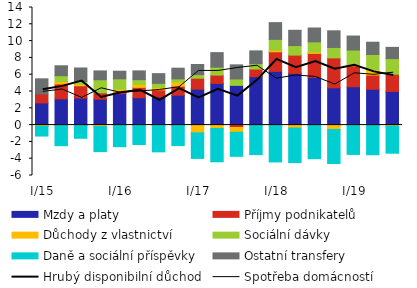
| Category | Mzdy a platy | Příjmy podnikatelů | Důchody z vlastnictví | Sociální dávky  | Daně a sociální příspěvky | Ostatní transfery |
|---|---|---|---|---|---|---|
|  I/15 | 2.644 | 1.067 | -0.089 | -0.068 | -1.147 | 1.798 |
| II | 3.127 | 1.772 | 0.282 | 0.699 | -2.453 | 1.182 |
| III | 3.227 | 1.458 | 0.182 | 0.346 | -1.568 | 1.587 |
| IV | 3.087 | 0.757 | -0.172 | 1.551 | -2.987 | 1.055 |
|  I/16 | 3.741 | 0.163 | 0.381 | 1.222 | -2.567 | 0.911 |
| II | 3.262 | 1.228 | 0.371 | 0.546 | -2.311 | 1.047 |
| III | 3.352 | 0.842 | 0.302 | 0.473 | -3.184 | 1.156 |
| IV | 3.566 | 1.066 | 0.51 | 0.365 | -2.44 | 1.271 |
|  I/17 | 4.283 | 1.297 | -0.919 | 0.427 | -3.047 | 1.205 |
| II | 4.957 | 0.999 | -0.395 | 0.943 | -3.973 | 1.731 |
| III | 4.729 | -0.286 | -0.562 | 0.761 | -2.87 | 1.682 |
| IV | 5.766 | 0.908 | -0.008 | 0.636 | -3.506 | 1.526 |
|  I/18 | 6.399 | 2.328 | 0.185 | 1.293 | -4.385 | 1.994 |
| II | 6.161 | 2.175 | -0.35 | 1.128 | -4.114 | 1.823 |
| III | 5.68 | 2.86 | 0.156 | 1.213 | -3.998 | 1.651 |
| IV | 4.444 | 3.556 | -0.518 | 1.243 | -4.056 | 1.983 |
|  I/19 | 4.567 | 2.487 | 0.175 | 1.707 | -3.491 | 1.666 |
| II | 4.262 | 1.698 | 0.622 | 1.82 | -3.532 | 1.465 |
| III | 4.011 | 2.052 | -0.12 | 1.858 | -3.227 | 1.334 |